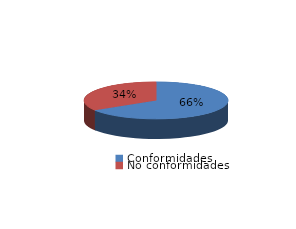
| Category | Series 0 |
|---|---|
| Conformidades | 2017 |
| No conformidades | 1034 |